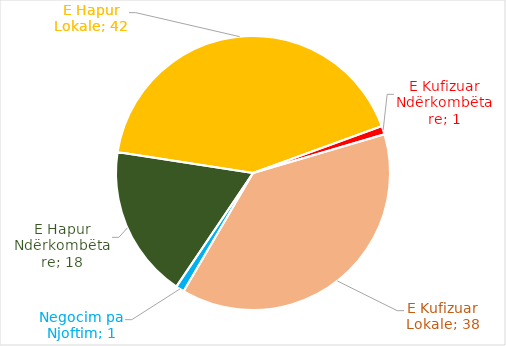
| Category | Nr. Procedurash |
|---|---|
| E Kufizuar Ndërkombëtare | 1 |
| E Kufizuar Lokale | 38 |
| Negocim pa Njoftim | 1 |
| E Hapur Ndërkombëtare | 18 |
| E Hapur Lokale | 42 |